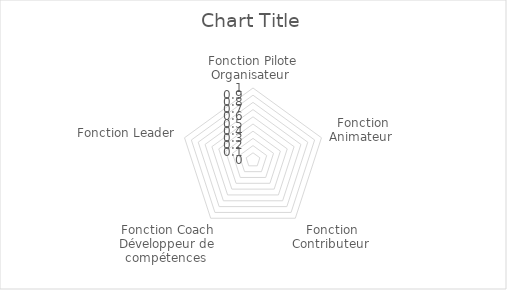
| Category | Series 0 |
|---|---|
| Fonction Pilote Organisateur  | 0 |
| Fonction Animateur  | 0 |
| Fonction Contributeur  | 0 |
| Fonction Coach Développeur de compétences  | 0 |
| Fonction Leader  | 0 |